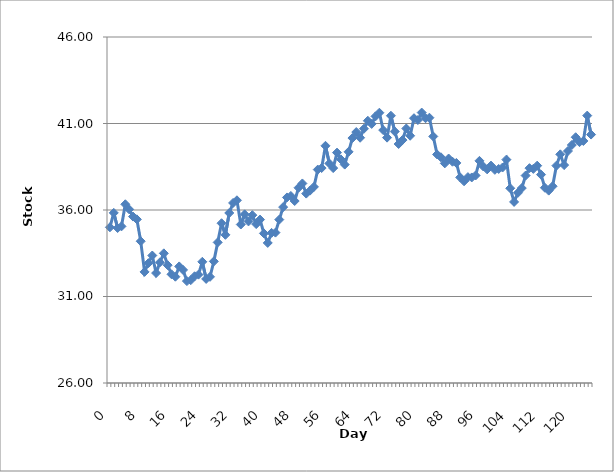
| Category | Series 0 |
|---|---|
| 0.0 | 35 |
| 1.0 | 35.833 |
| 2.0 | 34.959 |
| 3.0 | 35.053 |
| 4.0 | 36.331 |
| 5.0 | 36.037 |
| 6.0 | 35.62 |
| 7.0 | 35.459 |
| 8.0 | 34.194 |
| 9.0 | 32.422 |
| 10.0 | 32.928 |
| 11.0 | 33.369 |
| 12.0 | 32.355 |
| 13.0 | 32.976 |
| 14.0 | 33.495 |
| 15.0 | 32.81 |
| 16.0 | 32.284 |
| 17.0 | 32.144 |
| 18.0 | 32.738 |
| 19.0 | 32.535 |
| 20.0 | 31.891 |
| 21.0 | 31.944 |
| 22.0 | 32.169 |
| 23.0 | 32.264 |
| 24.0 | 33.006 |
| 25.0 | 32.016 |
| 26.0 | 32.138 |
| 27.0 | 33.03 |
| 28.0 | 34.128 |
| 29.0 | 35.236 |
| 30.0 | 34.565 |
| 31.0 | 35.827 |
| 32.0 | 36.408 |
| 33.0 | 36.561 |
| 34.0 | 35.162 |
| 35.0 | 35.749 |
| 36.0 | 35.34 |
| 37.0 | 35.701 |
| 38.0 | 35.186 |
| 39.0 | 35.446 |
| 40.0 | 34.649 |
| 41.0 | 34.097 |
| 42.0 | 34.678 |
| 43.0 | 34.693 |
| 44.0 | 35.445 |
| 45.0 | 36.167 |
| 46.0 | 36.726 |
| 47.0 | 36.811 |
| 48.0 | 36.519 |
| 49.0 | 37.285 |
| 50.0 | 37.534 |
| 51.0 | 36.948 |
| 52.0 | 37.121 |
| 53.0 | 37.337 |
| 54.0 | 38.337 |
| 55.0 | 38.425 |
| 56.0 | 39.711 |
| 57.0 | 38.692 |
| 58.0 | 38.423 |
| 59.0 | 39.317 |
| 60.0 | 38.927 |
| 61.0 | 38.625 |
| 62.0 | 39.363 |
| 63.0 | 40.16 |
| 64.0 | 40.506 |
| 65.0 | 40.177 |
| 66.0 | 40.697 |
| 67.0 | 41.158 |
| 68.0 | 40.976 |
| 69.0 | 41.413 |
| 70.0 | 41.623 |
| 71.0 | 40.619 |
| 72.0 | 40.182 |
| 73.0 | 41.449 |
| 74.0 | 40.538 |
| 75.0 | 39.816 |
| 76.0 | 40.041 |
| 77.0 | 40.711 |
| 78.0 | 40.292 |
| 79.0 | 41.306 |
| 80.0 | 41.199 |
| 81.0 | 41.632 |
| 82.0 | 41.304 |
| 83.0 | 41.335 |
| 84.0 | 40.252 |
| 85.0 | 39.213 |
| 86.0 | 39.047 |
| 87.0 | 38.696 |
| 88.0 | 38.976 |
| 89.0 | 38.791 |
| 90.0 | 38.721 |
| 91.0 | 37.883 |
| 92.0 | 37.66 |
| 93.0 | 37.9 |
| 94.0 | 37.882 |
| 95.0 | 37.995 |
| 96.0 | 38.841 |
| 97.0 | 38.516 |
| 98.0 | 38.349 |
| 99.0 | 38.566 |
| 100.0 | 38.322 |
| 101.0 | 38.373 |
| 102.0 | 38.455 |
| 103.0 | 38.912 |
| 104.0 | 37.256 |
| 105.0 | 36.467 |
| 106.0 | 36.994 |
| 107.0 | 37.267 |
| 108.0 | 37.991 |
| 109.0 | 38.418 |
| 110.0 | 38.376 |
| 111.0 | 38.562 |
| 112.0 | 38.046 |
| 113.0 | 37.287 |
| 114.0 | 37.12 |
| 115.0 | 37.373 |
| 116.0 | 38.563 |
| 117.0 | 39.218 |
| 118.0 | 38.597 |
| 119.0 | 39.41 |
| 120.0 | 39.757 |
| 121.0 | 40.205 |
| 122.0 | 39.922 |
| 123.0 | 39.99 |
| 124.0 | 41.457 |
| 125.0 | 40.36 |